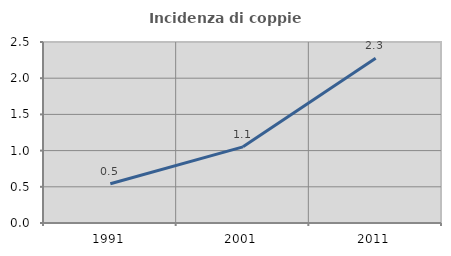
| Category | Incidenza di coppie miste |
|---|---|
| 1991.0 | 0.542 |
| 2001.0 | 1.052 |
| 2011.0 | 2.276 |